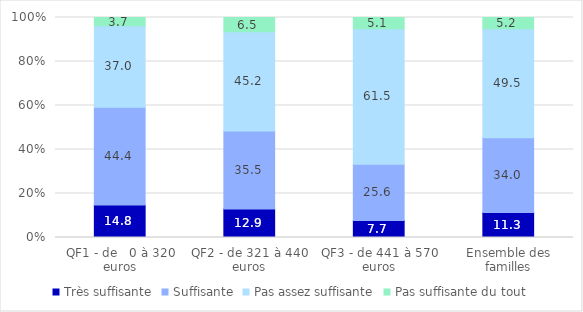
| Category | Très suffisante | Suffisante | Pas assez suffisante | Pas suffisante du tout |
|---|---|---|---|---|
| QF1 - de   0 à 320 euros | 14.815 | 44.444 | 37.037 | 3.704 |
| QF2 - de 321 à 440 euros | 12.903 | 35.484 | 45.161 | 6.452 |
| QF3 - de 441 à 570 euros | 7.692 | 25.641 | 61.538 | 5.128 |
| Ensemble des familles | 11.34 | 34.021 | 49.485 | 5.155 |